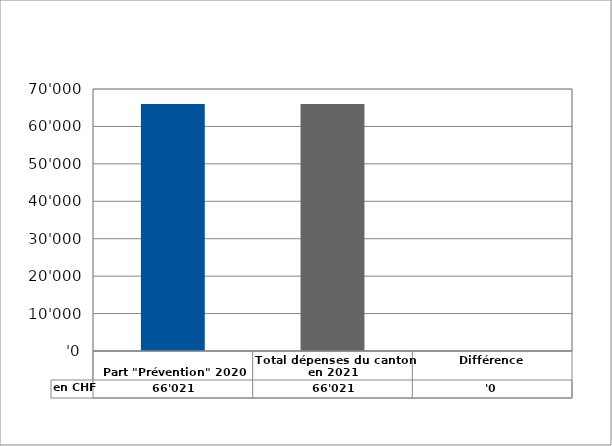
| Category | en CHF |
|---|---|
| 
Part "Prévention" 2020

 | 66021 |
| Total dépenses du canton en 2021 | 66021 |
| Différence | 0 |